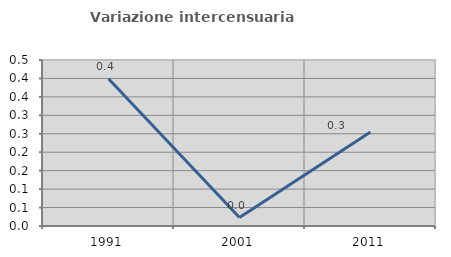
| Category | Variazione intercensuaria annua |
|---|---|
| 1991.0 | 0.399 |
| 2001.0 | 0.023 |
| 2011.0 | 0.255 |